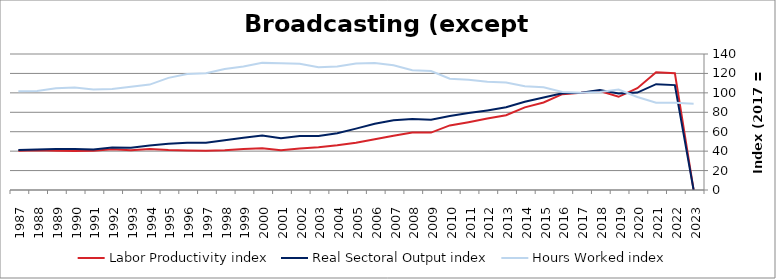
| Category | Labor Productivity index | Real Sectoral Output index | Hours Worked index |
|---|---|---|---|
| 2023.0 | 0 | 0 | 88.84 |
| 2022.0 | 120.304 | 107.991 | 89.765 |
| 2021.0 | 121.252 | 108.95 | 89.854 |
| 2020.0 | 104.828 | 100.309 | 95.69 |
| 2019.0 | 95.954 | 99.301 | 103.488 |
| 2018.0 | 101.952 | 102.835 | 100.865 |
| 2017.0 | 100 | 100 | 100 |
| 2016.0 | 98.677 | 99.659 | 100.995 |
| 2015.0 | 90.119 | 95.235 | 105.677 |
| 2014.0 | 85.092 | 90.798 | 106.706 |
| 2013.0 | 76.96 | 85.111 | 110.592 |
| 2012.0 | 73.507 | 81.937 | 111.468 |
| 2011.0 | 69.805 | 79.163 | 113.406 |
| 2010.0 | 66.509 | 76.146 | 114.489 |
| 2009.0 | 59.074 | 72.356 | 122.483 |
| 2008.0 | 59.299 | 73.128 | 123.32 |
| 2007.0 | 55.944 | 71.891 | 128.506 |
| 2006.0 | 52.145 | 68.145 | 130.683 |
| 2005.0 | 48.554 | 63.196 | 130.157 |
| 2004.0 | 46 | 58.461 | 127.087 |
| 2003.0 | 44.023 | 55.624 | 126.351 |
| 2002.0 | 42.827 | 55.681 | 130.014 |
| 2001.0 | 40.913 | 53.381 | 130.476 |
| 2000.0 | 42.876 | 56.109 | 130.863 |
| 1999.0 | 42.279 | 53.766 | 127.171 |
| 1998.0 | 41.046 | 51.156 | 124.63 |
| 1997.0 | 40.457 | 48.611 | 120.156 |
| 1996.0 | 40.772 | 48.721 | 119.495 |
| 1995.0 | 41.21 | 47.556 | 115.401 |
| 1994.0 | 42.175 | 45.772 | 108.529 |
| 1993.0 | 40.925 | 43.458 | 106.187 |
| 1992.0 | 41.982 | 43.631 | 103.928 |
| 1991.0 | 40.368 | 41.751 | 103.426 |
| 1990.0 | 40.027 | 42.229 | 105.5 |
| 1989.0 | 40.349 | 42.227 | 104.655 |
| 1988.0 | 40.92 | 41.657 | 101.802 |
| 1987.0 | 40.411 | 41.109 | 101.726 |